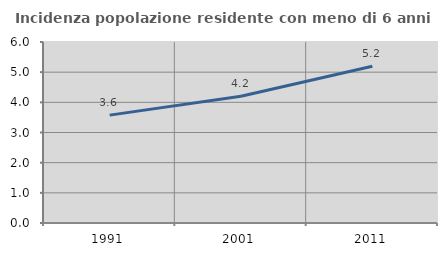
| Category | Incidenza popolazione residente con meno di 6 anni |
|---|---|
| 1991.0 | 3.576 |
| 2001.0 | 4.199 |
| 2011.0 | 5.199 |